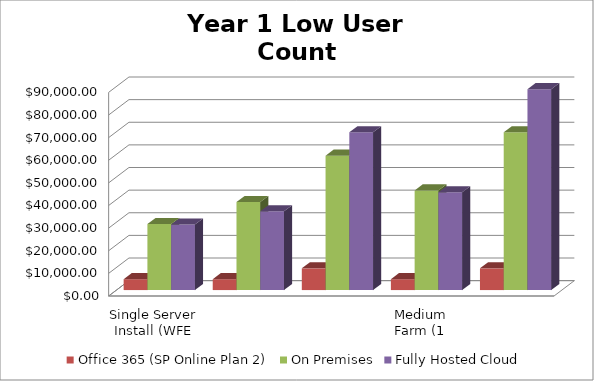
| Category | Office 365 (SP Online Plan 2) | On Premises | Fully Hosted Cloud |
|---|---|---|---|
| Single Server Install (WFE and SQL on 1 VM) | 4800 | 29160.412 | 28940 |
| Small Farm - Two Server Install (WFE and SQL) | 4800 | 38882.444 | 34820 |
| Small Farm w/ High Availability (2 WFE - 2 SQL) | 9600 | 59394.125 | 69700 |
| Medium Farm (1 WFE, 1 App/Index, 1 SQL) | 4800 | 44012.403 | 43220 |
| Medium Farm w/ High Availability (2 WFE, 2 A/I, 2 SQL) | 9600 | 69743.177 | 88780 |